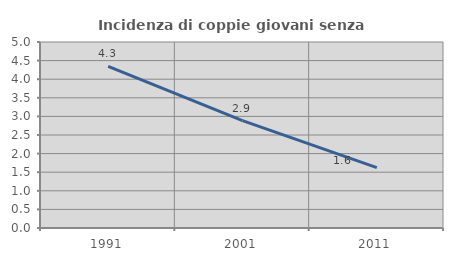
| Category | Incidenza di coppie giovani senza figli |
|---|---|
| 1991.0 | 4.344 |
| 2001.0 | 2.885 |
| 2011.0 | 1.621 |